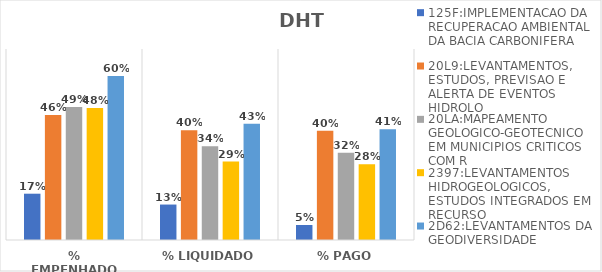
| Category | 125F:IMPLEMENTACAO DA RECUPERACAO AMBIENTAL DA BACIA CARBONIFERA | 20L9:LEVANTAMENTOS, ESTUDOS, PREVISAO E ALERTA DE EVENTOS HIDROLO | 20LA:MAPEAMENTO GEOLOGICO-GEOTECNICO EM MUNICIPIOS CRITICOS COM R | 2397:LEVANTAMENTOS HIDROGEOLOGICOS, ESTUDOS INTEGRADOS EM RECURSO | 2D62:LEVANTAMENTOS DA GEODIVERSIDADE |
|---|---|---|---|---|---|
| % EMPENHADO | 0.17 | 0.458 | 0.487 | 0.484 | 0.601 |
| % LIQUIDADO | 0.13 | 0.403 | 0.343 | 0.288 | 0.426 |
| % PAGO | 0.055 | 0.4 | 0.319 | 0.278 | 0.406 |